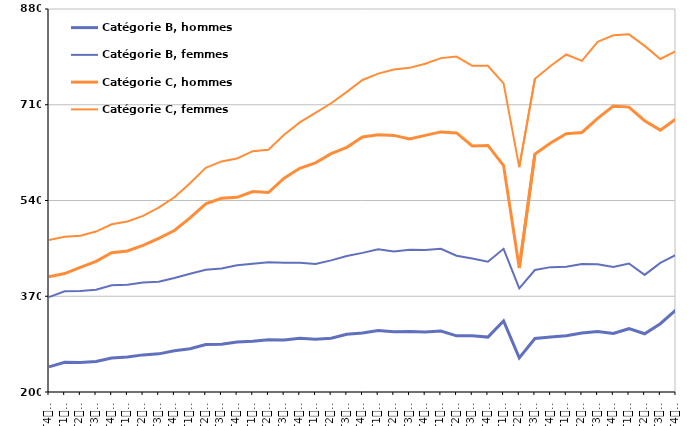
| Category | Catégorie B, hommes | Catégorie B, femmes | Catégorie C, hommes | Catégorie C, femmes |
|---|---|---|---|---|
| T4
2012 | 244.6 | 368.4 | 404.5 | 470 |
| T1
2013 | 252.7 | 378.8 | 410.3 | 475.5 |
| T2
2013 | 252.2 | 379.4 | 421.3 | 477.5 |
| T3
2013 | 254.2 | 381.6 | 431.9 | 484.9 |
| T4
2013 | 260.4 | 389.5 | 447.2 | 497.8 |
| T1
2014 | 262.1 | 390.4 | 450.4 | 502.6 |
| T2
2014 | 265.9 | 394.2 | 460.2 | 512.7 |
| T3
2014 | 267.7 | 395.6 | 472.9 | 527.4 |
| T4
2014 | 273.1 | 402.4 | 486.7 | 545.7 |
| T1
2015 | 276.9 | 410.1 | 509 | 570.7 |
| T2
2015 | 284.2 | 417.1 | 534.2 | 598.1 |
| T3
2015 | 284.8 | 419.4 | 543.9 | 609.4 |
| T4
2015 | 288.9 | 424.9 | 545.7 | 614.7 |
| T1
2016 | 290 | 427.5 | 555.9 | 627.6 |
| T2
2016 | 292.6 | 430.5 | 554.1 | 630.2 |
| T3
2016 | 292.3 | 429.5 | 579.6 | 656.8 |
| T4
2016 | 295.6 | 429.3 | 597.2 | 678.7 |
| T1
2017 | 293.8 | 427.2 | 606.9 | 695.5 |
| T2
2017 | 295.3 | 433.7 | 623.1 | 712.6 |
| T3
2017 | 302.5 | 441.4 | 634.4 | 732.8 |
| T4
2017 | 304.8 | 447 | 652.7 | 754 |
| T1
2018 | 309.3 | 453.5 | 656.8 | 765.3 |
| T2
2018 | 306.8 | 449.5 | 655.6 | 772.7 |
| T3
2018 | 307.3 | 452.5 | 649.2 | 775.5 |
| T4
2018 | 306.7 | 452.3 | 655.6 | 782.8 |
| T1
2019 | 308.2 | 454.2 | 661.8 | 792.8 |
| T2
2019 | 299.7 | 441.9 | 659.9 | 795.5 |
| T3
2019 | 300 | 436.9 | 636.8 | 779.1 |
| T4
2019 | 297.5 | 431.4 | 637.8 | 779.2 |
| T1
2020 | 326.2 | 454.2 | 602 | 748 |
| T2
2020 | 260.6 | 384 | 420.1 | 599.2 |
| T3
2020 | 294.9 | 416.6 | 622.6 | 756 |
| T4
2020 | 297.6 | 421.7 | 642.2 | 778.7 |
| T1
2021 | 299.7 | 422.3 | 658.5 | 799.2 |
| T2
2021 | 304.7 | 427.3 | 660.8 | 788 |
| T3
2021 | 307.5 | 426.9 | 685.7 | 821.8 |
| T4
2021 | 303.9 | 421.9 | 707.7 | 833.3 |
| T1
2022 | 312.4 | 428.2 | 705.8 | 835 |
| T2
2022 | 303.4 | 407.9 | 681.6 | 814.5 |
| T3
2022 | 321.2 | 429.3 | 665 | 791.3 |
| T4
2022 | 345.9 | 443.4 | 684.9 | 805.2 |